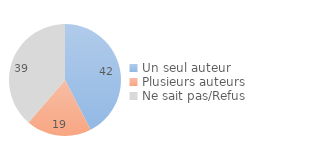
| Category | Series 0 |
|---|---|
| Un seul auteur | 42.438 |
| Plusieurs auteurs | 18.854 |
| Ne sait pas/Refus | 38.707 |